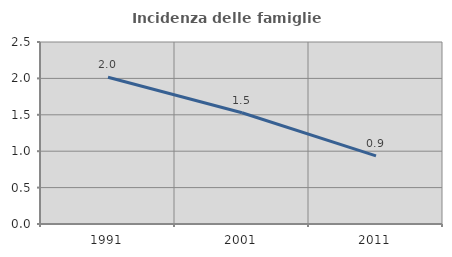
| Category | Incidenza delle famiglie numerose |
|---|---|
| 1991.0 | 2.015 |
| 2001.0 | 1.528 |
| 2011.0 | 0.936 |